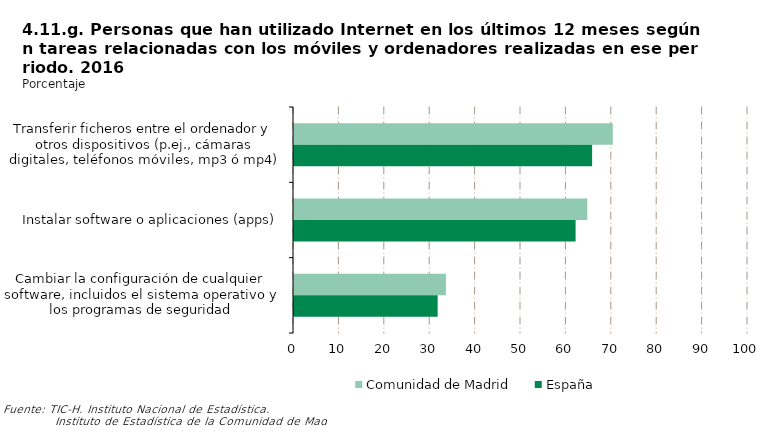
| Category | Comunidad de Madrid | España |
|---|---|---|
| Transferir ficheros entre el ordenador y otros dispositivos (p.ej., cámaras digitales, teléfonos móviles, mp3 ó mp4) | 70.214 | 65.666 |
| Instalar software o aplicaciones (apps) | 64.602 | 62.027 |
| Cambiar la configuración de cualquier software, incluidos el sistema operativo y los programas de seguridad | 33.464 | 31.636 |